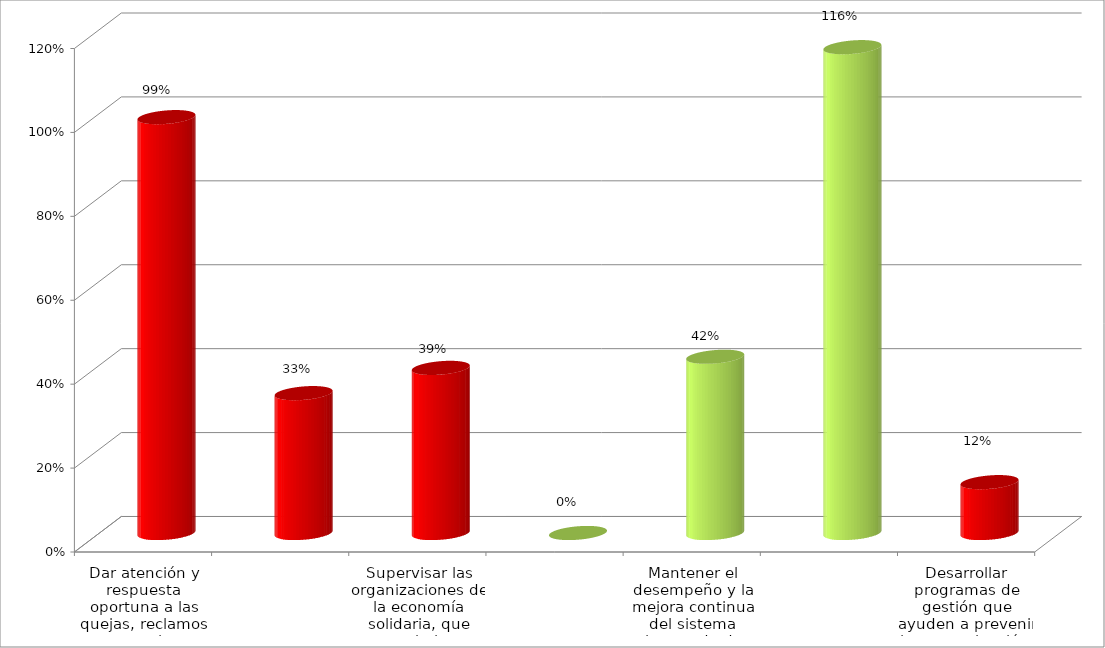
| Category | Series 0 |
|---|---|
| Dar atención y respuesta oportuna a las quejas, reclamos y consultas, formuladas por la ciudadania. | 0.991 |
| Formular, desarrollar y ejecutar, oportunamente, los proyectos de inversión de la entidad. | 0.333 |
| Supervisar las organizaciones de la economía solidaria, que estan bajo su competencia. | 0.394 |
| Mejorar los canales internos y externos de comunicación de la entidad. | 0 |
| Mantener el desempeño y la mejora continua del sistema integrado de gestión  | 0.42 |
| Mejorar la calidad del servicio y el medio ambiente fortaleciendo el Talento Humano. | 1.158 |
| Desarrollar programas de gestión que ayuden a prevenir la contaminación, a reducir y controlar los aspectos e impactos ambientales identificados | 0.121 |